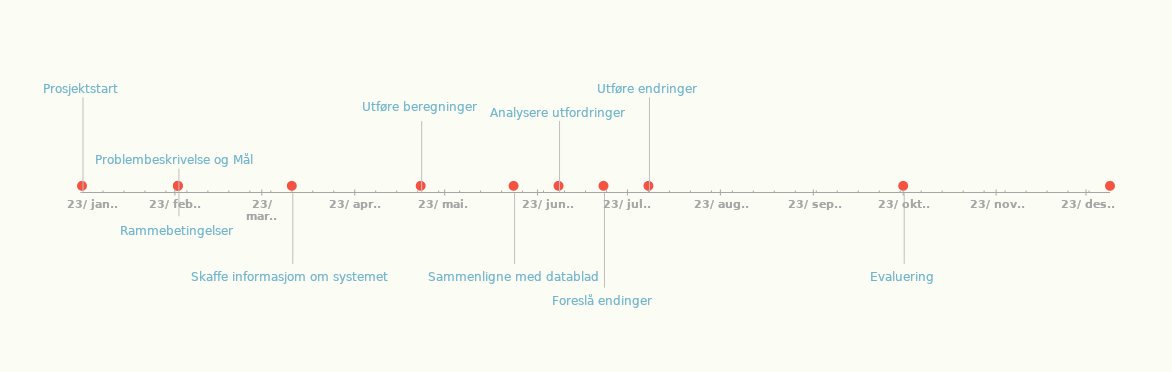
| Category | PLASSERING |
|---|---|
| Prosjektstart | 20 |
| Problembeskrivelse og Mål | 5 |
| Rammebetingelser | -5 |
| Skaffe informasjom om systemet | -15 |
| Utføre beregninger | 15 |
| Sammenligne med datablad | -15 |
| Analysere utfordringer | 15 |
| Foreslå endinger | -20 |
| Utføre endringer | 20 |
| Evaluering | -15 |
| Godkjenning KRM | 15 |